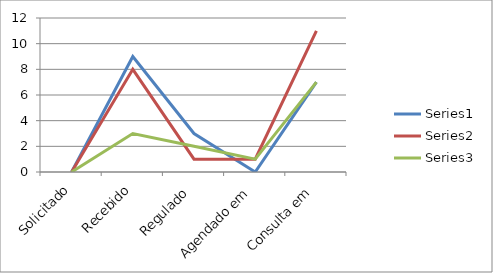
| Category | Series 0 | Series 1 | Series 2 |
|---|---|---|---|
| Solicitado | 0 | 0 | 0 |
| Recebido | 9 | 8 | 3 |
| Regulado | 3 | 1 | 2 |
| Agendado em | 0 | 1 | 1 |
| Consulta em | 7 | 11 | 7 |